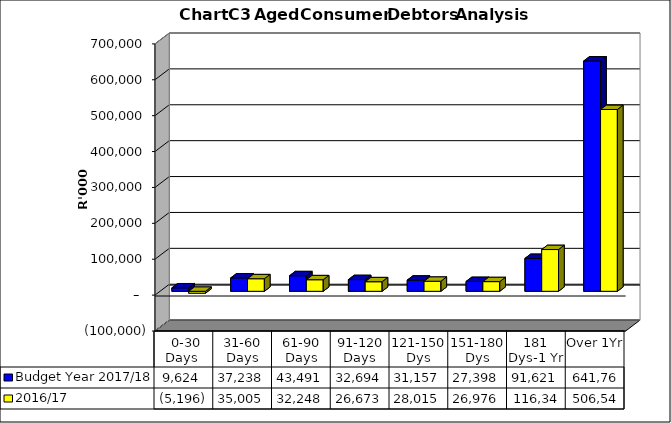
| Category | Budget Year 2017/18 | 2016/17 |
|---|---|---|
|  0-30 Days  | 9624222.46 | -5195950.38 |
| 31-60 Days | 37237783.65 | 35004756.85 |
| 61-90 Days | 43490884.32 | 32247745.91 |
| 91-120 Days | 32694169.07 | 26672858.04 |
| 121-150 Dys | 31157494.36 | 28015014.25 |
| 151-180 Dys | 27397573.7 | 26976066.85 |
| 181 Dys-1 Yr | 91620764.99 | 116348266.19 |
| Over 1Yr | 641767850.43 | 506547609.06 |